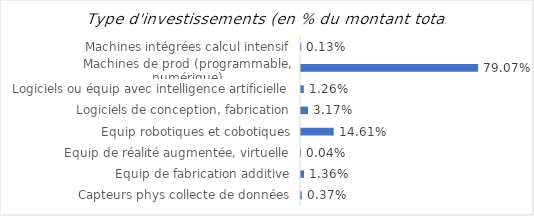
| Category | Series 0 |
|---|---|
| Capteurs phys collecte de données | 0.004 |
| Equip de fabrication additive | 0.014 |
| Equip de réalité augmentée, virtuelle | 0 |
| Equip robotiques et cobotiques | 0.146 |
| Logiciels de conception, fabrication | 0.032 |
| Logiciels ou équip avec intelligence artificielle | 0.013 |
| Machines de prod (programmable, numérique) | 0.791 |
| Machines intégrées calcul intensif | 0.001 |